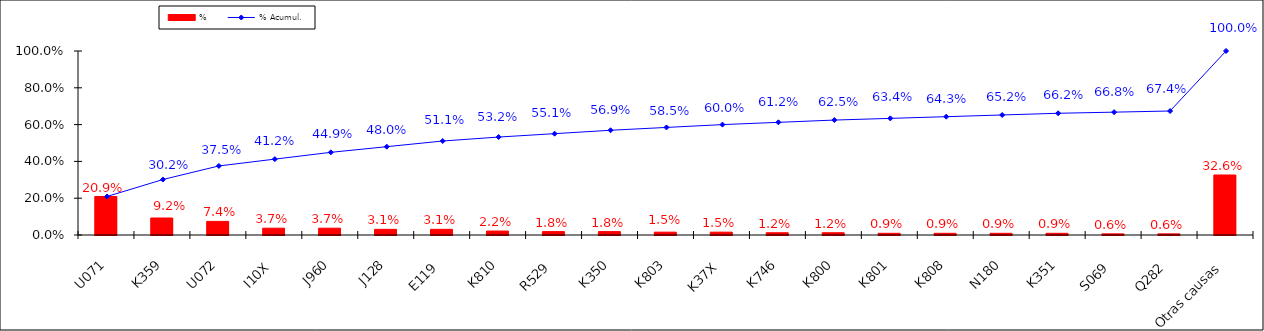
| Category | % |
|---|---|
| U071 | 0.209 |
| K359 | 0.092 |
| U072 | 0.074 |
| I10X | 0.037 |
| J960 | 0.037 |
| J128 | 0.031 |
| E119 | 0.031 |
| K810 | 0.022 |
| R529 | 0.018 |
| K350 | 0.018 |
| K803 | 0.015 |
| K37X | 0.015 |
| K746 | 0.012 |
| K800 | 0.012 |
| K801 | 0.009 |
| K808 | 0.009 |
| N180 | 0.009 |
| K351 | 0.009 |
| S069 | 0.006 |
| Q282 | 0.006 |
| Otras causas | 0.326 |